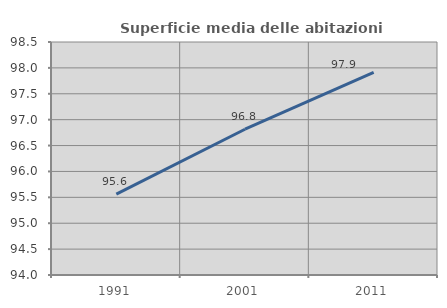
| Category | Superficie media delle abitazioni occupate |
|---|---|
| 1991.0 | 95.563 |
| 2001.0 | 96.815 |
| 2011.0 | 97.915 |